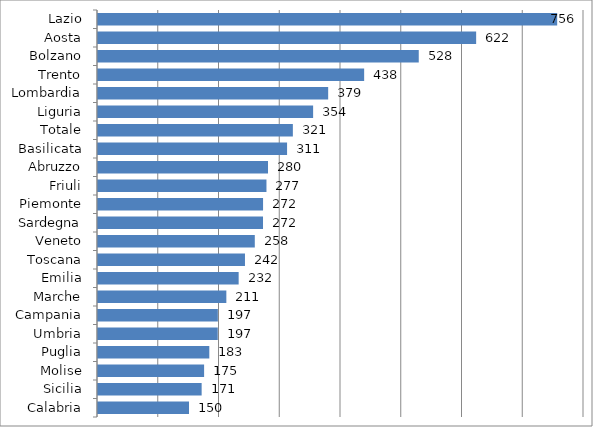
| Category | Series 0 |
|---|---|
| Lazio | 755.844 |
| Aosta | 622.47 |
| Bolzano | 527.993 |
| Trento | 438.114 |
| Lombardia | 378.89 |
| Liguria | 354.117 |
| Totale | 320.752 |
| Basilicata | 311.231 |
| Abruzzo | 279.846 |
| Friuli | 277.313 |
| Piemonte | 271.706 |
| Sardegna | 271.622 |
| Veneto | 258.105 |
| Toscana | 241.933 |
| Emilia | 231.527 |
| Marche | 211.269 |
| Campania | 197.267 |
| Umbria | 197.11 |
| Puglia | 183.235 |
| Molise | 174.663 |
| Sicilia | 170.61 |
| Calabria | 149.811 |